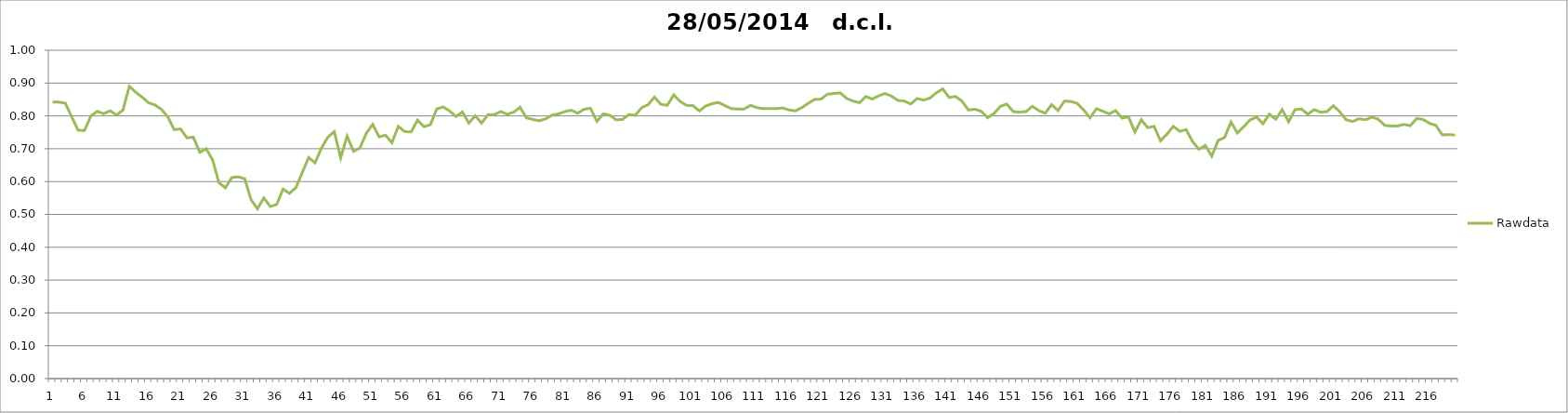
| Category | Rawdata |
|---|---|
| 0 | 0.842 |
| 1 | 0.842 |
| 2 | 0.839 |
| 3 | 0.798 |
| 4 | 0.756 |
| 5 | 0.756 |
| 6 | 0.8 |
| 7 | 0.814 |
| 8 | 0.807 |
| 9 | 0.816 |
| 10 | 0.803 |
| 11 | 0.818 |
| 12 | 0.89 |
| 13 | 0.872 |
| 14 | 0.857 |
| 15 | 0.84 |
| 16 | 0.833 |
| 17 | 0.82 |
| 18 | 0.797 |
| 19 | 0.758 |
| 20 | 0.76 |
| 21 | 0.733 |
| 22 | 0.735 |
| 23 | 0.689 |
| 24 | 0.7 |
| 25 | 0.666 |
| 26 | 0.596 |
| 27 | 0.581 |
| 28 | 0.612 |
| 29 | 0.614 |
| 30 | 0.609 |
| 31 | 0.545 |
| 32 | 0.517 |
| 33 | 0.55 |
| 34 | 0.524 |
| 35 | 0.53 |
| 36 | 0.577 |
| 37 | 0.564 |
| 38 | 0.581 |
| 39 | 0.627 |
| 40 | 0.673 |
| 41 | 0.657 |
| 42 | 0.702 |
| 43 | 0.735 |
| 44 | 0.752 |
| 45 | 0.672 |
| 46 | 0.738 |
| 47 | 0.692 |
| 48 | 0.702 |
| 49 | 0.747 |
| 50 | 0.774 |
| 51 | 0.736 |
| 52 | 0.741 |
| 53 | 0.718 |
| 54 | 0.768 |
| 55 | 0.752 |
| 56 | 0.751 |
| 57 | 0.787 |
| 58 | 0.767 |
| 59 | 0.773 |
| 60 | 0.821 |
| 61 | 0.827 |
| 62 | 0.815 |
| 63 | 0.798 |
| 64 | 0.812 |
| 65 | 0.778 |
| 66 | 0.8 |
| 67 | 0.778 |
| 68 | 0.804 |
| 69 | 0.804 |
| 70 | 0.813 |
| 71 | 0.805 |
| 72 | 0.811 |
| 73 | 0.826 |
| 74 | 0.794 |
| 75 | 0.789 |
| 76 | 0.785 |
| 77 | 0.791 |
| 78 | 0.802 |
| 79 | 0.806 |
| 80 | 0.813 |
| 81 | 0.817 |
| 82 | 0.808 |
| 83 | 0.82 |
| 84 | 0.823 |
| 85 | 0.783 |
| 86 | 0.806 |
| 87 | 0.802 |
| 88 | 0.788 |
| 89 | 0.789 |
| 90 | 0.804 |
| 91 | 0.802 |
| 92 | 0.825 |
| 93 | 0.834 |
| 94 | 0.857 |
| 95 | 0.835 |
| 96 | 0.832 |
| 97 | 0.864 |
| 98 | 0.844 |
| 99 | 0.832 |
| 100 | 0.831 |
| 101 | 0.815 |
| 102 | 0.83 |
| 103 | 0.837 |
| 104 | 0.841 |
| 105 | 0.831 |
| 106 | 0.822 |
| 107 | 0.821 |
| 108 | 0.821 |
| 109 | 0.832 |
| 110 | 0.825 |
| 111 | 0.822 |
| 112 | 0.822 |
| 113 | 0.822 |
| 114 | 0.824 |
| 115 | 0.818 |
| 116 | 0.815 |
| 117 | 0.825 |
| 118 | 0.838 |
| 119 | 0.85 |
| 120 | 0.851 |
| 121 | 0.866 |
| 122 | 0.868 |
| 123 | 0.87 |
| 124 | 0.853 |
| 125 | 0.845 |
| 126 | 0.84 |
| 127 | 0.859 |
| 128 | 0.851 |
| 129 | 0.861 |
| 130 | 0.868 |
| 131 | 0.86 |
| 132 | 0.847 |
| 133 | 0.845 |
| 134 | 0.836 |
| 135 | 0.853 |
| 136 | 0.848 |
| 137 | 0.854 |
| 138 | 0.87 |
| 139 | 0.882 |
| 140 | 0.856 |
| 141 | 0.859 |
| 142 | 0.845 |
| 143 | 0.818 |
| 144 | 0.82 |
| 145 | 0.814 |
| 146 | 0.794 |
| 147 | 0.807 |
| 148 | 0.829 |
| 149 | 0.836 |
| 150 | 0.813 |
| 151 | 0.811 |
| 152 | 0.813 |
| 153 | 0.829 |
| 154 | 0.816 |
| 155 | 0.808 |
| 156 | 0.834 |
| 157 | 0.816 |
| 158 | 0.845 |
| 159 | 0.844 |
| 160 | 0.838 |
| 161 | 0.818 |
| 162 | 0.794 |
| 163 | 0.822 |
| 164 | 0.814 |
| 165 | 0.806 |
| 166 | 0.816 |
| 167 | 0.793 |
| 168 | 0.797 |
| 169 | 0.751 |
| 170 | 0.788 |
| 171 | 0.764 |
| 172 | 0.768 |
| 173 | 0.724 |
| 174 | 0.744 |
| 175 | 0.768 |
| 176 | 0.753 |
| 177 | 0.758 |
| 178 | 0.722 |
| 179 | 0.698 |
| 180 | 0.71 |
| 181 | 0.677 |
| 182 | 0.725 |
| 183 | 0.734 |
| 184 | 0.781 |
| 185 | 0.748 |
| 186 | 0.767 |
| 187 | 0.788 |
| 188 | 0.796 |
| 189 | 0.776 |
| 190 | 0.805 |
| 191 | 0.79 |
| 192 | 0.819 |
| 193 | 0.782 |
| 194 | 0.819 |
| 195 | 0.821 |
| 196 | 0.805 |
| 197 | 0.819 |
| 198 | 0.811 |
| 199 | 0.813 |
| 200 | 0.831 |
| 201 | 0.812 |
| 202 | 0.788 |
| 203 | 0.783 |
| 204 | 0.791 |
| 205 | 0.788 |
| 206 | 0.796 |
| 207 | 0.79 |
| 208 | 0.771 |
| 209 | 0.769 |
| 210 | 0.769 |
| 211 | 0.774 |
| 212 | 0.77 |
| 213 | 0.792 |
| 214 | 0.789 |
| 215 | 0.777 |
| 216 | 0.771 |
| 217 | 0.742 |
| 218 | 0.743 |
| 219 | 0.741 |